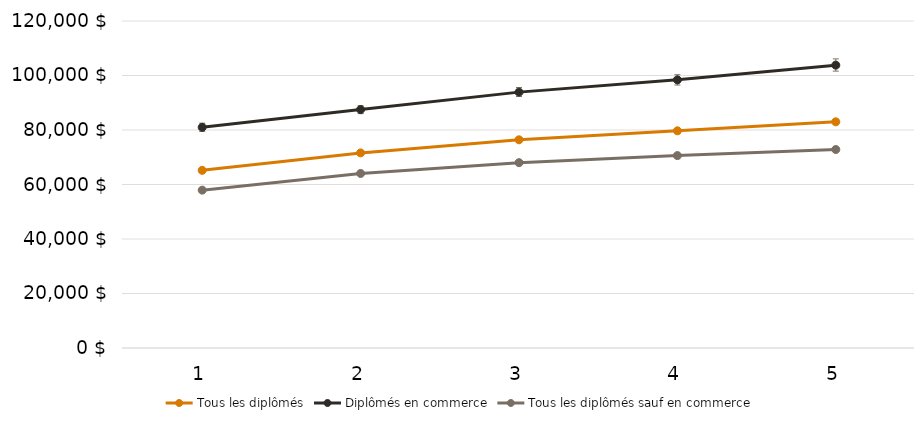
| Category | Tous les diplômés | Diplômés en commerce | Tous les diplômés sauf en commerce |
|---|---|---|---|
| 1.0 | 65200 | 81000 | 57930.884 |
| 2.0 | 71600 | 87500 | 64050 |
| 3.0 | 76400 | 93900 | 68008.358 |
| 4.0 | 79700 | 98400 | 70612.677 |
| 5.0 | 83000 | 103800 | 72842.966 |